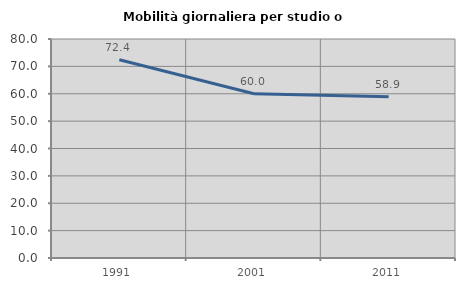
| Category | Mobilità giornaliera per studio o lavoro |
|---|---|
| 1991.0 | 72.436 |
| 2001.0 | 60 |
| 2011.0 | 58.919 |